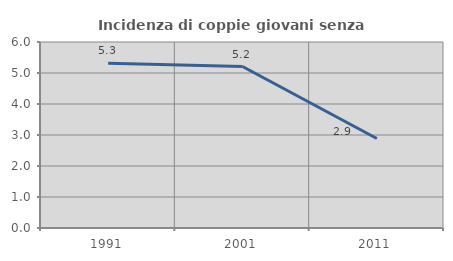
| Category | Incidenza di coppie giovani senza figli |
|---|---|
| 1991.0 | 5.312 |
| 2001.0 | 5.208 |
| 2011.0 | 2.887 |